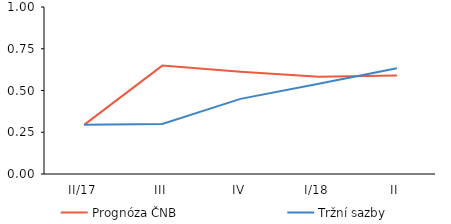
| Category | Prognóza ČNB | Tržní sazby |
|---|---|---|
| II/17 | 0.294 | 0.294 |
| III | 0.649 | 0.3 |
| IV | 0.612 | 0.45 |
| I/18 | 0.583 | 0.54 |
| II | 0.589 | 0.633 |